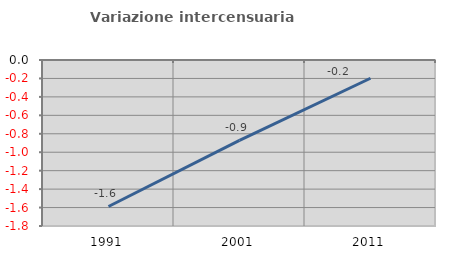
| Category | Variazione intercensuaria annua |
|---|---|
| 1991.0 | -1.588 |
| 2001.0 | -0.872 |
| 2011.0 | -0.198 |